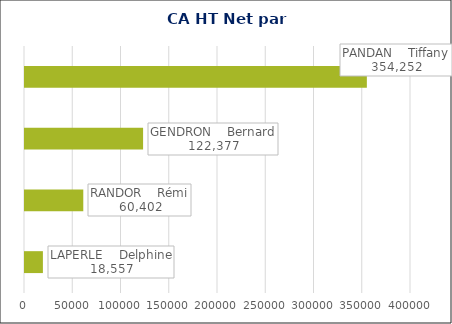
| Category | Total |
|---|---|
| LAPERLE    Delphine | 18557.4 |
| RANDOR    Rémi | 60401.59 |
| GENDRON    Bernard | 122376.62 |
| PANDAN    Tiffany | 354252.38 |